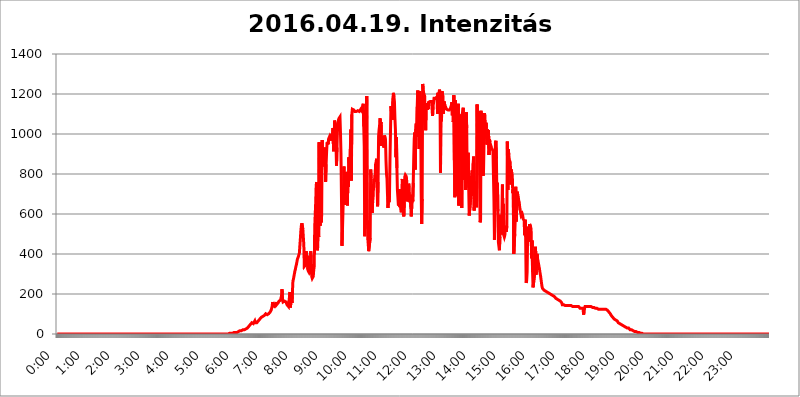
| Category | 2016.04.19. Intenzitás [W/m^2] |
|---|---|
| 0.0 | 0 |
| 0.0006944444444444445 | 0 |
| 0.001388888888888889 | 0 |
| 0.0020833333333333333 | 0 |
| 0.002777777777777778 | 0 |
| 0.003472222222222222 | 0 |
| 0.004166666666666667 | 0 |
| 0.004861111111111111 | 0 |
| 0.005555555555555556 | 0 |
| 0.0062499999999999995 | 0 |
| 0.006944444444444444 | 0 |
| 0.007638888888888889 | 0 |
| 0.008333333333333333 | 0 |
| 0.009027777777777779 | 0 |
| 0.009722222222222222 | 0 |
| 0.010416666666666666 | 0 |
| 0.011111111111111112 | 0 |
| 0.011805555555555555 | 0 |
| 0.012499999999999999 | 0 |
| 0.013194444444444444 | 0 |
| 0.013888888888888888 | 0 |
| 0.014583333333333332 | 0 |
| 0.015277777777777777 | 0 |
| 0.015972222222222224 | 0 |
| 0.016666666666666666 | 0 |
| 0.017361111111111112 | 0 |
| 0.018055555555555557 | 0 |
| 0.01875 | 0 |
| 0.019444444444444445 | 0 |
| 0.02013888888888889 | 0 |
| 0.020833333333333332 | 0 |
| 0.02152777777777778 | 0 |
| 0.022222222222222223 | 0 |
| 0.02291666666666667 | 0 |
| 0.02361111111111111 | 0 |
| 0.024305555555555556 | 0 |
| 0.024999999999999998 | 0 |
| 0.025694444444444447 | 0 |
| 0.02638888888888889 | 0 |
| 0.027083333333333334 | 0 |
| 0.027777777777777776 | 0 |
| 0.02847222222222222 | 0 |
| 0.029166666666666664 | 0 |
| 0.029861111111111113 | 0 |
| 0.030555555555555555 | 0 |
| 0.03125 | 0 |
| 0.03194444444444445 | 0 |
| 0.03263888888888889 | 0 |
| 0.03333333333333333 | 0 |
| 0.034027777777777775 | 0 |
| 0.034722222222222224 | 0 |
| 0.035416666666666666 | 0 |
| 0.036111111111111115 | 0 |
| 0.03680555555555556 | 0 |
| 0.0375 | 0 |
| 0.03819444444444444 | 0 |
| 0.03888888888888889 | 0 |
| 0.03958333333333333 | 0 |
| 0.04027777777777778 | 0 |
| 0.04097222222222222 | 0 |
| 0.041666666666666664 | 0 |
| 0.042361111111111106 | 0 |
| 0.04305555555555556 | 0 |
| 0.043750000000000004 | 0 |
| 0.044444444444444446 | 0 |
| 0.04513888888888889 | 0 |
| 0.04583333333333334 | 0 |
| 0.04652777777777778 | 0 |
| 0.04722222222222222 | 0 |
| 0.04791666666666666 | 0 |
| 0.04861111111111111 | 0 |
| 0.049305555555555554 | 0 |
| 0.049999999999999996 | 0 |
| 0.05069444444444445 | 0 |
| 0.051388888888888894 | 0 |
| 0.052083333333333336 | 0 |
| 0.05277777777777778 | 0 |
| 0.05347222222222222 | 0 |
| 0.05416666666666667 | 0 |
| 0.05486111111111111 | 0 |
| 0.05555555555555555 | 0 |
| 0.05625 | 0 |
| 0.05694444444444444 | 0 |
| 0.057638888888888885 | 0 |
| 0.05833333333333333 | 0 |
| 0.05902777777777778 | 0 |
| 0.059722222222222225 | 0 |
| 0.06041666666666667 | 0 |
| 0.061111111111111116 | 0 |
| 0.06180555555555556 | 0 |
| 0.0625 | 0 |
| 0.06319444444444444 | 0 |
| 0.06388888888888888 | 0 |
| 0.06458333333333334 | 0 |
| 0.06527777777777778 | 0 |
| 0.06597222222222222 | 0 |
| 0.06666666666666667 | 0 |
| 0.06736111111111111 | 0 |
| 0.06805555555555555 | 0 |
| 0.06874999999999999 | 0 |
| 0.06944444444444443 | 0 |
| 0.07013888888888889 | 0 |
| 0.07083333333333333 | 0 |
| 0.07152777777777779 | 0 |
| 0.07222222222222223 | 0 |
| 0.07291666666666667 | 0 |
| 0.07361111111111111 | 0 |
| 0.07430555555555556 | 0 |
| 0.075 | 0 |
| 0.07569444444444444 | 0 |
| 0.0763888888888889 | 0 |
| 0.07708333333333334 | 0 |
| 0.07777777777777778 | 0 |
| 0.07847222222222222 | 0 |
| 0.07916666666666666 | 0 |
| 0.0798611111111111 | 0 |
| 0.08055555555555556 | 0 |
| 0.08125 | 0 |
| 0.08194444444444444 | 0 |
| 0.08263888888888889 | 0 |
| 0.08333333333333333 | 0 |
| 0.08402777777777777 | 0 |
| 0.08472222222222221 | 0 |
| 0.08541666666666665 | 0 |
| 0.08611111111111112 | 0 |
| 0.08680555555555557 | 0 |
| 0.08750000000000001 | 0 |
| 0.08819444444444445 | 0 |
| 0.08888888888888889 | 0 |
| 0.08958333333333333 | 0 |
| 0.09027777777777778 | 0 |
| 0.09097222222222222 | 0 |
| 0.09166666666666667 | 0 |
| 0.09236111111111112 | 0 |
| 0.09305555555555556 | 0 |
| 0.09375 | 0 |
| 0.09444444444444444 | 0 |
| 0.09513888888888888 | 0 |
| 0.09583333333333333 | 0 |
| 0.09652777777777777 | 0 |
| 0.09722222222222222 | 0 |
| 0.09791666666666667 | 0 |
| 0.09861111111111111 | 0 |
| 0.09930555555555555 | 0 |
| 0.09999999999999999 | 0 |
| 0.10069444444444443 | 0 |
| 0.1013888888888889 | 0 |
| 0.10208333333333335 | 0 |
| 0.10277777777777779 | 0 |
| 0.10347222222222223 | 0 |
| 0.10416666666666667 | 0 |
| 0.10486111111111111 | 0 |
| 0.10555555555555556 | 0 |
| 0.10625 | 0 |
| 0.10694444444444444 | 0 |
| 0.1076388888888889 | 0 |
| 0.10833333333333334 | 0 |
| 0.10902777777777778 | 0 |
| 0.10972222222222222 | 0 |
| 0.1111111111111111 | 0 |
| 0.11180555555555556 | 0 |
| 0.11180555555555556 | 0 |
| 0.1125 | 0 |
| 0.11319444444444444 | 0 |
| 0.11388888888888889 | 0 |
| 0.11458333333333333 | 0 |
| 0.11527777777777777 | 0 |
| 0.11597222222222221 | 0 |
| 0.11666666666666665 | 0 |
| 0.1173611111111111 | 0 |
| 0.11805555555555557 | 0 |
| 0.11944444444444445 | 0 |
| 0.12013888888888889 | 0 |
| 0.12083333333333333 | 0 |
| 0.12152777777777778 | 0 |
| 0.12222222222222223 | 0 |
| 0.12291666666666667 | 0 |
| 0.12291666666666667 | 0 |
| 0.12361111111111112 | 0 |
| 0.12430555555555556 | 0 |
| 0.125 | 0 |
| 0.12569444444444444 | 0 |
| 0.12638888888888888 | 0 |
| 0.12708333333333333 | 0 |
| 0.16875 | 0 |
| 0.12847222222222224 | 0 |
| 0.12916666666666668 | 0 |
| 0.12986111111111112 | 0 |
| 0.13055555555555556 | 0 |
| 0.13125 | 0 |
| 0.13194444444444445 | 0 |
| 0.1326388888888889 | 0 |
| 0.13333333333333333 | 0 |
| 0.13402777777777777 | 0 |
| 0.13402777777777777 | 0 |
| 0.13472222222222222 | 0 |
| 0.13541666666666666 | 0 |
| 0.1361111111111111 | 0 |
| 0.13749999999999998 | 0 |
| 0.13819444444444443 | 0 |
| 0.1388888888888889 | 0 |
| 0.13958333333333334 | 0 |
| 0.14027777777777778 | 0 |
| 0.14097222222222222 | 0 |
| 0.14166666666666666 | 0 |
| 0.1423611111111111 | 0 |
| 0.14305555555555557 | 0 |
| 0.14375000000000002 | 0 |
| 0.14444444444444446 | 0 |
| 0.1451388888888889 | 0 |
| 0.1451388888888889 | 0 |
| 0.14652777777777778 | 0 |
| 0.14722222222222223 | 0 |
| 0.14791666666666667 | 0 |
| 0.1486111111111111 | 0 |
| 0.14930555555555555 | 0 |
| 0.15 | 0 |
| 0.15069444444444444 | 0 |
| 0.15138888888888888 | 0 |
| 0.15208333333333332 | 0 |
| 0.15277777777777776 | 0 |
| 0.15347222222222223 | 0 |
| 0.15416666666666667 | 0 |
| 0.15486111111111112 | 0 |
| 0.15555555555555556 | 0 |
| 0.15625 | 0 |
| 0.15694444444444444 | 0 |
| 0.15763888888888888 | 0 |
| 0.15833333333333333 | 0 |
| 0.15902777777777777 | 0 |
| 0.15972222222222224 | 0 |
| 0.16041666666666668 | 0 |
| 0.16111111111111112 | 0 |
| 0.16180555555555556 | 0 |
| 0.1625 | 0 |
| 0.16319444444444445 | 0 |
| 0.1638888888888889 | 0 |
| 0.16458333333333333 | 0 |
| 0.16527777777777777 | 0 |
| 0.16597222222222222 | 0 |
| 0.16666666666666666 | 0 |
| 0.1673611111111111 | 0 |
| 0.16805555555555554 | 0 |
| 0.16874999999999998 | 0 |
| 0.16944444444444443 | 0 |
| 0.17013888888888887 | 0 |
| 0.1708333333333333 | 0 |
| 0.17152777777777775 | 0 |
| 0.17222222222222225 | 0 |
| 0.1729166666666667 | 0 |
| 0.17361111111111113 | 0 |
| 0.17430555555555557 | 0 |
| 0.17500000000000002 | 0 |
| 0.17569444444444446 | 0 |
| 0.1763888888888889 | 0 |
| 0.17708333333333334 | 0 |
| 0.17777777777777778 | 0 |
| 0.17847222222222223 | 0 |
| 0.17916666666666667 | 0 |
| 0.1798611111111111 | 0 |
| 0.18055555555555555 | 0 |
| 0.18125 | 0 |
| 0.18194444444444444 | 0 |
| 0.1826388888888889 | 0 |
| 0.18333333333333335 | 0 |
| 0.1840277777777778 | 0 |
| 0.18472222222222223 | 0 |
| 0.18541666666666667 | 0 |
| 0.18611111111111112 | 0 |
| 0.18680555555555556 | 0 |
| 0.1875 | 0 |
| 0.18819444444444444 | 0 |
| 0.18888888888888888 | 0 |
| 0.18958333333333333 | 0 |
| 0.19027777777777777 | 0 |
| 0.1909722222222222 | 0 |
| 0.19166666666666665 | 0 |
| 0.19236111111111112 | 0 |
| 0.19305555555555554 | 0 |
| 0.19375 | 0 |
| 0.19444444444444445 | 0 |
| 0.1951388888888889 | 0 |
| 0.19583333333333333 | 0 |
| 0.19652777777777777 | 0 |
| 0.19722222222222222 | 0 |
| 0.19791666666666666 | 0 |
| 0.1986111111111111 | 0 |
| 0.19930555555555554 | 0 |
| 0.19999999999999998 | 0 |
| 0.20069444444444443 | 0 |
| 0.20138888888888887 | 0 |
| 0.2020833333333333 | 0 |
| 0.2027777777777778 | 0 |
| 0.2034722222222222 | 0 |
| 0.2041666666666667 | 0 |
| 0.20486111111111113 | 0 |
| 0.20555555555555557 | 0 |
| 0.20625000000000002 | 0 |
| 0.20694444444444446 | 0 |
| 0.2076388888888889 | 0 |
| 0.20833333333333334 | 0 |
| 0.20902777777777778 | 0 |
| 0.20972222222222223 | 0 |
| 0.21041666666666667 | 0 |
| 0.2111111111111111 | 0 |
| 0.21180555555555555 | 0 |
| 0.2125 | 0 |
| 0.21319444444444444 | 0 |
| 0.2138888888888889 | 0 |
| 0.21458333333333335 | 0 |
| 0.2152777777777778 | 0 |
| 0.21597222222222223 | 0 |
| 0.21666666666666667 | 0 |
| 0.21736111111111112 | 0 |
| 0.21805555555555556 | 0 |
| 0.21875 | 0 |
| 0.21944444444444444 | 0 |
| 0.22013888888888888 | 0 |
| 0.22083333333333333 | 0 |
| 0.22152777777777777 | 0 |
| 0.2222222222222222 | 0 |
| 0.22291666666666665 | 0 |
| 0.2236111111111111 | 0 |
| 0.22430555555555556 | 0 |
| 0.225 | 0 |
| 0.22569444444444445 | 0 |
| 0.2263888888888889 | 0 |
| 0.22708333333333333 | 0 |
| 0.22777777777777777 | 0 |
| 0.22847222222222222 | 0 |
| 0.22916666666666666 | 0 |
| 0.2298611111111111 | 0 |
| 0.23055555555555554 | 0 |
| 0.23124999999999998 | 0 |
| 0.23194444444444443 | 0 |
| 0.23263888888888887 | 0 |
| 0.2333333333333333 | 0 |
| 0.2340277777777778 | 0 |
| 0.2347222222222222 | 0 |
| 0.2354166666666667 | 0 |
| 0.23611111111111113 | 0 |
| 0.23680555555555557 | 0 |
| 0.23750000000000002 | 0 |
| 0.23819444444444446 | 0 |
| 0.2388888888888889 | 0 |
| 0.23958333333333334 | 0 |
| 0.24027777777777778 | 0 |
| 0.24097222222222223 | 0 |
| 0.24166666666666667 | 3.525 |
| 0.2423611111111111 | 3.525 |
| 0.24305555555555555 | 3.525 |
| 0.24375 | 3.525 |
| 0.24444444444444446 | 3.525 |
| 0.24513888888888888 | 3.525 |
| 0.24583333333333335 | 3.525 |
| 0.2465277777777778 | 3.525 |
| 0.24722222222222223 | 3.525 |
| 0.24791666666666667 | 7.887 |
| 0.24861111111111112 | 7.887 |
| 0.24930555555555556 | 7.887 |
| 0.25 | 7.887 |
| 0.25069444444444444 | 7.887 |
| 0.2513888888888889 | 7.887 |
| 0.2520833333333333 | 7.887 |
| 0.25277777777777777 | 12.257 |
| 0.2534722222222222 | 12.257 |
| 0.25416666666666665 | 12.257 |
| 0.2548611111111111 | 12.257 |
| 0.2555555555555556 | 16.636 |
| 0.25625000000000003 | 16.636 |
| 0.2569444444444445 | 21.024 |
| 0.2576388888888889 | 21.024 |
| 0.25833333333333336 | 16.636 |
| 0.2590277777777778 | 16.636 |
| 0.25972222222222224 | 21.024 |
| 0.2604166666666667 | 21.024 |
| 0.2611111111111111 | 21.024 |
| 0.26180555555555557 | 21.024 |
| 0.2625 | 21.024 |
| 0.26319444444444445 | 21.024 |
| 0.2638888888888889 | 25.419 |
| 0.26458333333333334 | 25.419 |
| 0.2652777777777778 | 25.419 |
| 0.2659722222222222 | 29.823 |
| 0.26666666666666666 | 29.823 |
| 0.2673611111111111 | 34.234 |
| 0.26805555555555555 | 34.234 |
| 0.26875 | 38.653 |
| 0.26944444444444443 | 38.653 |
| 0.2701388888888889 | 43.079 |
| 0.2708333333333333 | 47.511 |
| 0.27152777777777776 | 51.951 |
| 0.2722222222222222 | 51.951 |
| 0.27291666666666664 | 56.398 |
| 0.2736111111111111 | 56.398 |
| 0.2743055555555555 | 60.85 |
| 0.27499999999999997 | 51.951 |
| 0.27569444444444446 | 56.398 |
| 0.27638888888888885 | 56.398 |
| 0.27708333333333335 | 65.31 |
| 0.2777777777777778 | 56.398 |
| 0.27847222222222223 | 51.951 |
| 0.2791666666666667 | 51.951 |
| 0.2798611111111111 | 56.398 |
| 0.28055555555555556 | 56.398 |
| 0.28125 | 60.85 |
| 0.28194444444444444 | 65.31 |
| 0.2826388888888889 | 69.775 |
| 0.2833333333333333 | 69.775 |
| 0.28402777777777777 | 74.246 |
| 0.2847222222222222 | 74.246 |
| 0.28541666666666665 | 78.722 |
| 0.28611111111111115 | 83.205 |
| 0.28680555555555554 | 83.205 |
| 0.28750000000000003 | 83.205 |
| 0.2881944444444445 | 87.692 |
| 0.2888888888888889 | 87.692 |
| 0.28958333333333336 | 92.184 |
| 0.2902777777777778 | 92.184 |
| 0.29097222222222224 | 92.184 |
| 0.2916666666666667 | 96.682 |
| 0.2923611111111111 | 101.184 |
| 0.29305555555555557 | 96.682 |
| 0.29375 | 96.682 |
| 0.29444444444444445 | 96.682 |
| 0.2951388888888889 | 96.682 |
| 0.29583333333333334 | 96.682 |
| 0.2965277777777778 | 101.184 |
| 0.2972222222222222 | 101.184 |
| 0.29791666666666666 | 101.184 |
| 0.2986111111111111 | 110.201 |
| 0.29930555555555555 | 114.716 |
| 0.3 | 119.235 |
| 0.30069444444444443 | 128.284 |
| 0.3013888888888889 | 137.347 |
| 0.3020833333333333 | 160.056 |
| 0.30277777777777776 | 141.884 |
| 0.3034722222222222 | 146.423 |
| 0.30416666666666664 | 141.884 |
| 0.3048611111111111 | 137.347 |
| 0.3055555555555555 | 141.884 |
| 0.30624999999999997 | 146.423 |
| 0.3069444444444444 | 160.056 |
| 0.3076388888888889 | 146.423 |
| 0.30833333333333335 | 146.423 |
| 0.3090277777777778 | 150.964 |
| 0.30972222222222223 | 155.509 |
| 0.3104166666666667 | 160.056 |
| 0.3111111111111111 | 164.605 |
| 0.31180555555555556 | 164.605 |
| 0.3125 | 169.156 |
| 0.31319444444444444 | 169.156 |
| 0.3138888888888889 | 169.156 |
| 0.3145833333333333 | 191.937 |
| 0.31527777777777777 | 223.873 |
| 0.3159722222222222 | 169.156 |
| 0.31666666666666665 | 160.056 |
| 0.31736111111111115 | 160.056 |
| 0.31805555555555554 | 160.056 |
| 0.31875000000000003 | 164.605 |
| 0.3194444444444445 | 164.605 |
| 0.3201388888888889 | 164.605 |
| 0.32083333333333336 | 160.056 |
| 0.3215277777777778 | 155.509 |
| 0.32222222222222224 | 146.423 |
| 0.3229166666666667 | 146.423 |
| 0.3236111111111111 | 141.884 |
| 0.32430555555555557 | 137.347 |
| 0.325 | 137.347 |
| 0.32569444444444445 | 141.884 |
| 0.3263888888888889 | 210.182 |
| 0.32708333333333334 | 132.814 |
| 0.3277777777777778 | 132.814 |
| 0.3284722222222222 | 205.62 |
| 0.32916666666666666 | 155.509 |
| 0.3298611111111111 | 210.182 |
| 0.33055555555555555 | 264.932 |
| 0.33125 | 274.047 |
| 0.33194444444444443 | 287.709 |
| 0.3326388888888889 | 301.354 |
| 0.3333333333333333 | 314.98 |
| 0.3340277777777778 | 324.052 |
| 0.3347222222222222 | 337.639 |
| 0.3354166666666667 | 346.682 |
| 0.3361111111111111 | 360.221 |
| 0.3368055555555556 | 373.729 |
| 0.33749999999999997 | 378.224 |
| 0.33819444444444446 | 387.202 |
| 0.33888888888888885 | 396.164 |
| 0.33958333333333335 | 405.108 |
| 0.34027777777777773 | 440.702 |
| 0.34097222222222223 | 475.972 |
| 0.3416666666666666 | 515.223 |
| 0.3423611111111111 | 541.121 |
| 0.3430555555555555 | 553.986 |
| 0.34375 | 558.261 |
| 0.3444444444444445 | 523.88 |
| 0.3451388888888889 | 484.735 |
| 0.3458333333333334 | 445.129 |
| 0.34652777777777777 | 337.639 |
| 0.34722222222222227 | 333.113 |
| 0.34791666666666665 | 333.113 |
| 0.34861111111111115 | 346.682 |
| 0.34930555555555554 | 414.035 |
| 0.35000000000000003 | 346.682 |
| 0.3506944444444444 | 391.685 |
| 0.3513888888888889 | 324.052 |
| 0.3520833333333333 | 314.98 |
| 0.3527777777777778 | 319.517 |
| 0.3534722222222222 | 305.898 |
| 0.3541666666666667 | 305.898 |
| 0.3548611111111111 | 314.98 |
| 0.35555555555555557 | 414.035 |
| 0.35625 | 328.584 |
| 0.35694444444444445 | 287.709 |
| 0.3576388888888889 | 278.603 |
| 0.35833333333333334 | 283.156 |
| 0.3590277777777778 | 287.709 |
| 0.3597222222222222 | 319.517 |
| 0.36041666666666666 | 337.639 |
| 0.3611111111111111 | 532.513 |
| 0.36180555555555555 | 596.45 |
| 0.3625 | 658.909 |
| 0.36319444444444443 | 743.859 |
| 0.3638888888888889 | 759.723 |
| 0.3645833333333333 | 418.492 |
| 0.3652777777777778 | 431.833 |
| 0.3659722222222222 | 515.223 |
| 0.3666666666666667 | 484.735 |
| 0.3673611111111111 | 958.814 |
| 0.3680555555555556 | 642.4 |
| 0.36874999999999997 | 541.121 |
| 0.36944444444444446 | 650.667 |
| 0.37013888888888885 | 558.261 |
| 0.37083333333333335 | 592.233 |
| 0.37152777777777773 | 970.034 |
| 0.37222222222222223 | 891.099 |
| 0.3729166666666666 | 837.682 |
| 0.3736111111111111 | 902.447 |
| 0.3743055555555555 | 921.298 |
| 0.375 | 932.576 |
| 0.3756944444444445 | 891.099 |
| 0.3763888888888889 | 759.723 |
| 0.3770833333333334 | 849.199 |
| 0.37777777777777777 | 909.996 |
| 0.37847222222222227 | 958.814 |
| 0.37916666666666665 | 958.814 |
| 0.37986111111111115 | 947.58 |
| 0.38055555555555554 | 973.772 |
| 0.38125000000000003 | 981.244 |
| 0.3819444444444444 | 984.98 |
| 0.3826388888888889 | 992.448 |
| 0.3833333333333333 | 996.182 |
| 0.3840277777777778 | 984.98 |
| 0.3847222222222222 | 966.295 |
| 0.3854166666666667 | 966.295 |
| 0.3861111111111111 | 1003.65 |
| 0.38680555555555557 | 1029.798 |
| 0.3875 | 913.766 |
| 0.38819444444444445 | 951.327 |
| 0.3888888888888889 | 1067.267 |
| 0.38958333333333334 | 1067.267 |
| 0.3902777777777778 | 1044.762 |
| 0.3909722222222222 | 1044.762 |
| 0.39166666666666666 | 841.526 |
| 0.3923611111111111 | 932.576 |
| 0.39305555555555555 | 1037.277 |
| 0.39375 | 1037.277 |
| 0.39444444444444443 | 1071.027 |
| 0.3951388888888889 | 1078.555 |
| 0.3958333333333333 | 1082.324 |
| 0.3965277777777778 | 1086.097 |
| 0.3972222222222222 | 1007.383 |
| 0.3979166666666667 | 906.223 |
| 0.3986111111111111 | 687.544 |
| 0.3993055555555556 | 440.702 |
| 0.39999999999999997 | 519.555 |
| 0.40069444444444446 | 609.062 |
| 0.40138888888888885 | 707.8 |
| 0.40208333333333335 | 837.682 |
| 0.40277777777777773 | 755.766 |
| 0.40347222222222223 | 775.492 |
| 0.4041666666666666 | 646.537 |
| 0.4048611111111111 | 719.877 |
| 0.4055555555555555 | 810.641 |
| 0.40625 | 735.89 |
| 0.4069444444444445 | 642.4 |
| 0.4076388888888889 | 775.492 |
| 0.4083333333333334 | 735.89 |
| 0.40902777777777777 | 883.516 |
| 0.40972222222222227 | 879.719 |
| 0.41041666666666665 | 829.981 |
| 0.41111111111111115 | 925.06 |
| 0.41180555555555554 | 1022.323 |
| 0.41250000000000003 | 767.62 |
| 0.4131944444444444 | 1097.437 |
| 0.4138888888888889 | 1124.056 |
| 0.4145833333333333 | 1124.056 |
| 0.4152777777777778 | 1120.238 |
| 0.4159722222222222 | 1120.238 |
| 0.4166666666666667 | 1116.426 |
| 0.4173611111111111 | 1112.618 |
| 0.41805555555555557 | 1112.618 |
| 0.41875 | 1112.618 |
| 0.41944444444444445 | 1112.618 |
| 0.4201388888888889 | 1112.618 |
| 0.42083333333333334 | 1116.426 |
| 0.4215277777777778 | 1116.426 |
| 0.4222222222222222 | 1116.426 |
| 0.42291666666666666 | 1116.426 |
| 0.4236111111111111 | 1112.618 |
| 0.42430555555555555 | 1112.618 |
| 0.425 | 1116.426 |
| 0.42569444444444443 | 1124.056 |
| 0.4263888888888889 | 1127.879 |
| 0.4270833333333333 | 1116.426 |
| 0.4277777777777778 | 1131.708 |
| 0.4284722222222222 | 1139.384 |
| 0.4291666666666667 | 1150.946 |
| 0.4298611111111111 | 1037.277 |
| 0.4305555555555556 | 940.082 |
| 0.43124999999999997 | 489.108 |
| 0.43194444444444446 | 493.475 |
| 0.43263888888888885 | 735.89 |
| 0.43333333333333335 | 699.717 |
| 0.43402777777777773 | 1189.969 |
| 0.43472222222222223 | 545.416 |
| 0.4354166666666666 | 566.793 |
| 0.4361111111111111 | 453.968 |
| 0.4368055555555555 | 414.035 |
| 0.4375 | 409.574 |
| 0.4381944444444445 | 418.492 |
| 0.4388888888888889 | 480.356 |
| 0.4395833333333334 | 822.26 |
| 0.44027777777777777 | 779.42 |
| 0.44097222222222227 | 695.666 |
| 0.44166666666666665 | 604.864 |
| 0.44236111111111115 | 658.909 |
| 0.44305555555555554 | 687.544 |
| 0.44375000000000003 | 751.803 |
| 0.4444444444444444 | 775.492 |
| 0.4451388888888889 | 759.723 |
| 0.4458333333333333 | 795.074 |
| 0.4465277777777778 | 849.199 |
| 0.4472222222222222 | 860.676 |
| 0.4479166666666667 | 875.918 |
| 0.4486111111111111 | 731.896 |
| 0.44930555555555557 | 638.256 |
| 0.45 | 759.723 |
| 0.45069444444444445 | 988.714 |
| 0.4513888888888889 | 1022.323 |
| 0.45208333333333334 | 1041.019 |
| 0.4527777777777778 | 1078.555 |
| 0.4534722222222222 | 1044.762 |
| 0.45416666666666666 | 1059.756 |
| 0.4548611111111111 | 940.082 |
| 0.45555555555555555 | 951.327 |
| 0.45625 | 970.034 |
| 0.45694444444444443 | 977.508 |
| 0.4576388888888889 | 988.714 |
| 0.4583333333333333 | 932.576 |
| 0.4590277777777778 | 992.448 |
| 0.4597222222222222 | 992.448 |
| 0.4604166666666667 | 966.295 |
| 0.4611111111111111 | 864.493 |
| 0.4618055555555556 | 798.974 |
| 0.46249999999999997 | 775.492 |
| 0.46319444444444446 | 695.666 |
| 0.46388888888888885 | 629.948 |
| 0.46458333333333335 | 695.666 |
| 0.46527777777777773 | 658.909 |
| 0.46597222222222223 | 691.608 |
| 0.4666666666666666 | 872.114 |
| 0.4673611111111111 | 1007.383 |
| 0.4680555555555555 | 1139.384 |
| 0.46875 | 1108.816 |
| 0.4694444444444445 | 1105.019 |
| 0.4701388888888889 | 1071.027 |
| 0.4708333333333334 | 1178.177 |
| 0.47152777777777777 | 1205.82 |
| 0.47222222222222227 | 1186.03 |
| 0.47291666666666665 | 1162.571 |
| 0.47361111111111115 | 1078.555 |
| 0.47430555555555554 | 1022.323 |
| 0.47500000000000003 | 883.516 |
| 0.4756944444444444 | 984.98 |
| 0.4763888888888889 | 829.981 |
| 0.4770833333333333 | 719.877 |
| 0.4777777777777778 | 683.473 |
| 0.4784722222222222 | 642.4 |
| 0.4791666666666667 | 691.608 |
| 0.4798611111111111 | 723.889 |
| 0.48055555555555557 | 634.105 |
| 0.48125 | 650.667 |
| 0.48194444444444445 | 654.791 |
| 0.4826388888888889 | 609.062 |
| 0.48333333333333334 | 719.877 |
| 0.4840277777777778 | 775.492 |
| 0.4847222222222222 | 629.948 |
| 0.48541666666666666 | 596.45 |
| 0.4861111111111111 | 588.009 |
| 0.48680555555555555 | 663.019 |
| 0.4875 | 787.258 |
| 0.48819444444444443 | 795.074 |
| 0.4888888888888889 | 798.974 |
| 0.4895833333333333 | 787.258 |
| 0.4902777777777778 | 759.723 |
| 0.4909722222222222 | 663.019 |
| 0.4916666666666667 | 699.717 |
| 0.4923611111111111 | 711.832 |
| 0.4930555555555556 | 751.803 |
| 0.49374999999999997 | 687.544 |
| 0.49444444444444446 | 658.909 |
| 0.49513888888888885 | 695.666 |
| 0.49583333333333335 | 634.105 |
| 0.49652777777777773 | 588.009 |
| 0.49722222222222223 | 588.009 |
| 0.4979166666666666 | 695.666 |
| 0.4986111111111111 | 663.019 |
| 0.4993055555555555 | 755.766 |
| 0.5 | 883.516 |
| 0.5006944444444444 | 977.508 |
| 0.5013888888888889 | 1007.383 |
| 0.5020833333333333 | 822.26 |
| 0.5027777777777778 | 1026.06 |
| 0.5034722222222222 | 1052.255 |
| 0.5041666666666667 | 984.98 |
| 0.5048611111111111 | 1135.543 |
| 0.5055555555555555 | 1217.812 |
| 0.50625 | 1166.46 |
| 0.5069444444444444 | 1178.177 |
| 0.5076388888888889 | 925.06 |
| 0.5083333333333333 | 1213.804 |
| 0.5090277777777777 | 1209.807 |
| 0.5097222222222222 | 1154.814 |
| 0.5104166666666666 | 707.8 |
| 0.5111111111111112 | 549.704 |
| 0.5118055555555555 | 675.311 |
| 0.5125000000000001 | 1250.275 |
| 0.5131944444444444 | 1225.859 |
| 0.513888888888889 | 1205.82 |
| 0.5145833333333333 | 1197.876 |
| 0.5152777777777778 | 1189.969 |
| 0.5159722222222222 | 1101.226 |
| 0.5166666666666667 | 1018.587 |
| 0.517361111111111 | 1120.238 |
| 0.5180555555555556 | 1150.946 |
| 0.5187499999999999 | 1120.238 |
| 0.5194444444444445 | 1154.814 |
| 0.5201388888888888 | 1124.056 |
| 0.5208333333333334 | 1158.689 |
| 0.5215277777777778 | 1158.689 |
| 0.5222222222222223 | 1158.689 |
| 0.5229166666666667 | 1162.571 |
| 0.5236111111111111 | 1158.689 |
| 0.5243055555555556 | 1158.689 |
| 0.525 | 1162.571 |
| 0.5256944444444445 | 1162.571 |
| 0.5263888888888889 | 1089.873 |
| 0.5270833333333333 | 1139.384 |
| 0.5277777777777778 | 1154.814 |
| 0.5284722222222222 | 1178.177 |
| 0.5291666666666667 | 1178.177 |
| 0.5298611111111111 | 1178.177 |
| 0.5305555555555556 | 1178.177 |
| 0.53125 | 1182.099 |
| 0.5319444444444444 | 1182.099 |
| 0.5326388888888889 | 1186.03 |
| 0.5333333333333333 | 1101.226 |
| 0.5340277777777778 | 1205.82 |
| 0.5347222222222222 | 1124.056 |
| 0.5354166666666667 | 1201.843 |
| 0.5361111111111111 | 1221.83 |
| 0.5368055555555555 | 1205.82 |
| 0.5375 | 806.757 |
| 0.5381944444444444 | 1178.177 |
| 0.5388888888888889 | 1063.51 |
| 0.5395833333333333 | 1213.804 |
| 0.5402777777777777 | 1197.876 |
| 0.5409722222222222 | 1189.969 |
| 0.5416666666666666 | 1101.226 |
| 0.5423611111111112 | 1162.571 |
| 0.5430555555555555 | 1158.689 |
| 0.5437500000000001 | 1143.232 |
| 0.5444444444444444 | 1139.384 |
| 0.545138888888889 | 1131.708 |
| 0.5458333333333333 | 1124.056 |
| 0.5465277777777778 | 1124.056 |
| 0.5472222222222222 | 1124.056 |
| 0.5479166666666667 | 1120.238 |
| 0.548611111111111 | 1120.238 |
| 0.5493055555555556 | 1120.238 |
| 0.5499999999999999 | 1120.238 |
| 0.5506944444444445 | 1124.056 |
| 0.5513888888888888 | 1127.879 |
| 0.5520833333333334 | 1135.543 |
| 0.5527777777777778 | 1143.232 |
| 0.5534722222222223 | 1158.689 |
| 0.5541666666666667 | 1093.653 |
| 0.5548611111111111 | 1158.689 |
| 0.5555555555555556 | 1059.756 |
| 0.55625 | 1193.918 |
| 0.5569444444444445 | 868.305 |
| 0.5576388888888889 | 683.473 |
| 0.5583333333333333 | 1170.358 |
| 0.5590277777777778 | 1074.789 |
| 0.5597222222222222 | 783.342 |
| 0.5604166666666667 | 841.526 |
| 0.5611111111111111 | 691.608 |
| 0.5618055555555556 | 898.668 |
| 0.5625 | 1150.946 |
| 0.5631944444444444 | 642.4 |
| 0.5638888888888889 | 860.676 |
| 0.5645833333333333 | 902.447 |
| 0.5652777777777778 | 1097.437 |
| 0.5659722222222222 | 1089.873 |
| 0.5666666666666667 | 1071.027 |
| 0.5673611111111111 | 629.948 |
| 0.5680555555555555 | 1101.226 |
| 0.56875 | 1105.019 |
| 0.5694444444444444 | 1131.708 |
| 0.5701388888888889 | 771.559 |
| 0.5708333333333333 | 818.392 |
| 0.5715277777777777 | 1063.51 |
| 0.5722222222222222 | 1093.653 |
| 0.5729166666666666 | 719.877 |
| 0.5736111111111112 | 1108.816 |
| 0.5743055555555555 | 1029.798 |
| 0.5750000000000001 | 751.803 |
| 0.5756944444444444 | 864.493 |
| 0.576388888888889 | 906.223 |
| 0.5770833333333333 | 731.896 |
| 0.5777777777777778 | 592.233 |
| 0.5784722222222222 | 596.45 |
| 0.5791666666666667 | 592.233 |
| 0.579861111111111 | 679.395 |
| 0.5805555555555556 | 755.766 |
| 0.5812499999999999 | 795.074 |
| 0.5819444444444445 | 818.392 |
| 0.5826388888888888 | 691.608 |
| 0.5833333333333334 | 853.029 |
| 0.5840277777777778 | 887.309 |
| 0.5847222222222223 | 617.436 |
| 0.5854166666666667 | 654.791 |
| 0.5861111111111111 | 687.544 |
| 0.5868055555555556 | 695.666 |
| 0.5875 | 763.674 |
| 0.5881944444444445 | 634.105 |
| 0.5888888888888889 | 1147.086 |
| 0.5895833333333333 | 958.814 |
| 0.5902777777777778 | 1048.508 |
| 0.5909722222222222 | 1112.618 |
| 0.5916666666666667 | 1086.097 |
| 0.5923611111111111 | 1086.097 |
| 0.5930555555555556 | 558.261 |
| 0.59375 | 571.049 |
| 0.5944444444444444 | 1116.426 |
| 0.5951388888888889 | 999.916 |
| 0.5958333333333333 | 1105.019 |
| 0.5965277777777778 | 1108.816 |
| 0.5972222222222222 | 791.169 |
| 0.5979166666666667 | 822.26 |
| 0.5986111111111111 | 966.295 |
| 0.5993055555555555 | 1105.019 |
| 0.6 | 1052.255 |
| 0.6006944444444444 | 977.508 |
| 0.6013888888888889 | 1056.004 |
| 0.6020833333333333 | 1059.756 |
| 0.6027777777777777 | 947.58 |
| 0.6034722222222222 | 1022.323 |
| 0.6041666666666666 | 999.916 |
| 0.6048611111111112 | 1018.587 |
| 0.6055555555555555 | 894.885 |
| 0.6062500000000001 | 973.772 |
| 0.6069444444444444 | 958.814 |
| 0.607638888888889 | 947.58 |
| 0.6083333333333333 | 940.082 |
| 0.6090277777777778 | 932.576 |
| 0.6097222222222222 | 928.819 |
| 0.6104166666666667 | 921.298 |
| 0.611111111111111 | 913.766 |
| 0.6118055555555556 | 913.766 |
| 0.6124999999999999 | 667.123 |
| 0.6131944444444445 | 471.582 |
| 0.6138888888888888 | 687.544 |
| 0.6145833333333334 | 958.814 |
| 0.6152777777777778 | 966.295 |
| 0.6159722222222223 | 875.918 |
| 0.6166666666666667 | 663.019 |
| 0.6173611111111111 | 755.766 |
| 0.6180555555555556 | 613.252 |
| 0.61875 | 458.38 |
| 0.6194444444444445 | 453.968 |
| 0.6201388888888889 | 418.492 |
| 0.6208333333333333 | 484.735 |
| 0.6215277777777778 | 596.45 |
| 0.6222222222222222 | 523.88 |
| 0.6229166666666667 | 497.836 |
| 0.6236111111111111 | 588.009 |
| 0.6243055555555556 | 747.834 |
| 0.625 | 613.252 |
| 0.6256944444444444 | 650.667 |
| 0.6263888888888889 | 493.475 |
| 0.6270833333333333 | 484.735 |
| 0.6277777777777778 | 493.475 |
| 0.6284722222222222 | 541.121 |
| 0.6291666666666667 | 519.555 |
| 0.6298611111111111 | 510.885 |
| 0.6305555555555555 | 541.121 |
| 0.63125 | 962.555 |
| 0.6319444444444444 | 719.877 |
| 0.6326388888888889 | 925.06 |
| 0.6333333333333333 | 894.885 |
| 0.6340277777777777 | 872.114 |
| 0.6347222222222222 | 872.114 |
| 0.6354166666666666 | 856.855 |
| 0.6361111111111112 | 747.834 |
| 0.6368055555555555 | 822.26 |
| 0.6375000000000001 | 802.868 |
| 0.6381944444444444 | 795.074 |
| 0.638888888888889 | 703.762 |
| 0.6395833333333333 | 723.889 |
| 0.6402777777777778 | 400.638 |
| 0.6409722222222222 | 405.108 |
| 0.6416666666666667 | 502.192 |
| 0.642361111111111 | 575.299 |
| 0.6430555555555556 | 735.89 |
| 0.6437499999999999 | 562.53 |
| 0.6444444444444445 | 634.105 |
| 0.6451388888888888 | 711.832 |
| 0.6458333333333334 | 695.666 |
| 0.6465277777777778 | 687.544 |
| 0.6472222222222223 | 667.123 |
| 0.6479166666666667 | 658.909 |
| 0.6486111111111111 | 634.105 |
| 0.6493055555555556 | 634.105 |
| 0.65 | 604.864 |
| 0.6506944444444445 | 592.233 |
| 0.6513888888888889 | 592.233 |
| 0.6520833333333333 | 600.661 |
| 0.6527777777777778 | 592.233 |
| 0.6534722222222222 | 575.299 |
| 0.6541666666666667 | 571.049 |
| 0.6548611111111111 | 566.793 |
| 0.6555555555555556 | 493.475 |
| 0.65625 | 571.049 |
| 0.6569444444444444 | 484.735 |
| 0.6576388888888889 | 255.813 |
| 0.6583333333333333 | 264.932 |
| 0.6590277777777778 | 310.44 |
| 0.6597222222222222 | 489.108 |
| 0.6604166666666667 | 536.82 |
| 0.6611111111111111 | 462.786 |
| 0.6618055555555555 | 523.88 |
| 0.6625 | 549.704 |
| 0.6631944444444444 | 545.416 |
| 0.6638888888888889 | 536.82 |
| 0.6645833333333333 | 523.88 |
| 0.6652777777777777 | 378.224 |
| 0.6659722222222222 | 467.187 |
| 0.6666666666666666 | 310.44 |
| 0.6673611111111111 | 233 |
| 0.6680555555555556 | 228.436 |
| 0.6687500000000001 | 237.564 |
| 0.6694444444444444 | 301.354 |
| 0.6701388888888888 | 373.729 |
| 0.6708333333333334 | 436.27 |
| 0.6715277777777778 | 296.808 |
| 0.6722222222222222 | 346.682 |
| 0.6729166666666666 | 400.638 |
| 0.6736111111111112 | 378.224 |
| 0.6743055555555556 | 364.728 |
| 0.6749999999999999 | 351.198 |
| 0.6756944444444444 | 337.639 |
| 0.6763888888888889 | 324.052 |
| 0.6770833333333334 | 305.898 |
| 0.6777777777777777 | 292.259 |
| 0.6784722222222223 | 274.047 |
| 0.6791666666666667 | 255.813 |
| 0.6798611111111111 | 237.564 |
| 0.6805555555555555 | 228.436 |
| 0.68125 | 228.436 |
| 0.6819444444444445 | 223.873 |
| 0.6826388888888889 | 219.309 |
| 0.6833333333333332 | 219.309 |
| 0.6840277777777778 | 219.309 |
| 0.6847222222222222 | 214.746 |
| 0.6854166666666667 | 214.746 |
| 0.686111111111111 | 210.182 |
| 0.6868055555555556 | 210.182 |
| 0.6875 | 210.182 |
| 0.6881944444444444 | 210.182 |
| 0.688888888888889 | 205.62 |
| 0.6895833333333333 | 205.62 |
| 0.6902777777777778 | 201.058 |
| 0.6909722222222222 | 201.058 |
| 0.6916666666666668 | 201.058 |
| 0.6923611111111111 | 196.497 |
| 0.6930555555555555 | 196.497 |
| 0.69375 | 191.937 |
| 0.6944444444444445 | 191.937 |
| 0.6951388888888889 | 191.937 |
| 0.6958333333333333 | 191.937 |
| 0.6965277777777777 | 187.378 |
| 0.6972222222222223 | 187.378 |
| 0.6979166666666666 | 182.82 |
| 0.6986111111111111 | 182.82 |
| 0.6993055555555556 | 178.264 |
| 0.7000000000000001 | 178.264 |
| 0.7006944444444444 | 173.709 |
| 0.7013888888888888 | 173.709 |
| 0.7020833333333334 | 173.709 |
| 0.7027777777777778 | 169.156 |
| 0.7034722222222222 | 169.156 |
| 0.7041666666666666 | 164.605 |
| 0.7048611111111112 | 164.605 |
| 0.7055555555555556 | 164.605 |
| 0.7062499999999999 | 164.605 |
| 0.7069444444444444 | 160.056 |
| 0.7076388888888889 | 155.509 |
| 0.7083333333333334 | 146.423 |
| 0.7090277777777777 | 146.423 |
| 0.7097222222222223 | 146.423 |
| 0.7104166666666667 | 146.423 |
| 0.7111111111111111 | 146.423 |
| 0.7118055555555555 | 141.884 |
| 0.7125 | 141.884 |
| 0.7131944444444445 | 141.884 |
| 0.7138888888888889 | 141.884 |
| 0.7145833333333332 | 141.884 |
| 0.7152777777777778 | 141.884 |
| 0.7159722222222222 | 141.884 |
| 0.7166666666666667 | 141.884 |
| 0.717361111111111 | 141.884 |
| 0.7180555555555556 | 141.884 |
| 0.71875 | 141.884 |
| 0.7194444444444444 | 141.884 |
| 0.720138888888889 | 141.884 |
| 0.7208333333333333 | 141.884 |
| 0.7215277777777778 | 137.347 |
| 0.7222222222222222 | 137.347 |
| 0.7229166666666668 | 137.347 |
| 0.7236111111111111 | 137.347 |
| 0.7243055555555555 | 137.347 |
| 0.725 | 137.347 |
| 0.7256944444444445 | 137.347 |
| 0.7263888888888889 | 137.347 |
| 0.7270833333333333 | 137.347 |
| 0.7277777777777777 | 137.347 |
| 0.7284722222222223 | 137.347 |
| 0.7291666666666666 | 137.347 |
| 0.7298611111111111 | 137.347 |
| 0.7305555555555556 | 137.347 |
| 0.7312500000000001 | 137.347 |
| 0.7319444444444444 | 137.347 |
| 0.7326388888888888 | 137.347 |
| 0.7333333333333334 | 128.284 |
| 0.7340277777777778 | 128.284 |
| 0.7347222222222222 | 123.758 |
| 0.7354166666666666 | 128.284 |
| 0.7361111111111112 | 132.814 |
| 0.7368055555555556 | 132.814 |
| 0.7374999999999999 | 128.284 |
| 0.7381944444444444 | 96.682 |
| 0.7388888888888889 | 110.201 |
| 0.7395833333333334 | 128.284 |
| 0.7402777777777777 | 137.347 |
| 0.7409722222222223 | 137.347 |
| 0.7416666666666667 | 137.347 |
| 0.7423611111111111 | 137.347 |
| 0.7430555555555555 | 137.347 |
| 0.74375 | 137.347 |
| 0.7444444444444445 | 137.347 |
| 0.7451388888888889 | 137.347 |
| 0.7458333333333332 | 137.347 |
| 0.7465277777777778 | 137.347 |
| 0.7472222222222222 | 137.347 |
| 0.7479166666666667 | 137.347 |
| 0.748611111111111 | 137.347 |
| 0.7493055555555556 | 137.347 |
| 0.75 | 137.347 |
| 0.7506944444444444 | 132.814 |
| 0.751388888888889 | 132.814 |
| 0.7520833333333333 | 132.814 |
| 0.7527777777777778 | 132.814 |
| 0.7534722222222222 | 128.284 |
| 0.7541666666666668 | 128.284 |
| 0.7548611111111111 | 128.284 |
| 0.7555555555555555 | 132.814 |
| 0.75625 | 128.284 |
| 0.7569444444444445 | 128.284 |
| 0.7576388888888889 | 128.284 |
| 0.7583333333333333 | 123.758 |
| 0.7590277777777777 | 123.758 |
| 0.7597222222222223 | 128.284 |
| 0.7604166666666666 | 128.284 |
| 0.7611111111111111 | 123.758 |
| 0.7618055555555556 | 123.758 |
| 0.7625000000000001 | 123.758 |
| 0.7631944444444444 | 123.758 |
| 0.7638888888888888 | 123.758 |
| 0.7645833333333334 | 123.758 |
| 0.7652777777777778 | 123.758 |
| 0.7659722222222222 | 123.758 |
| 0.7666666666666666 | 123.758 |
| 0.7673611111111112 | 123.758 |
| 0.7680555555555556 | 123.758 |
| 0.7687499999999999 | 123.758 |
| 0.7694444444444444 | 123.758 |
| 0.7701388888888889 | 123.758 |
| 0.7708333333333334 | 123.758 |
| 0.7715277777777777 | 119.235 |
| 0.7722222222222223 | 119.235 |
| 0.7729166666666667 | 114.716 |
| 0.7736111111111111 | 110.201 |
| 0.7743055555555555 | 110.201 |
| 0.775 | 105.69 |
| 0.7756944444444445 | 101.184 |
| 0.7763888888888889 | 96.682 |
| 0.7770833333333332 | 92.184 |
| 0.7777777777777778 | 92.184 |
| 0.7784722222222222 | 87.692 |
| 0.7791666666666667 | 83.205 |
| 0.779861111111111 | 83.205 |
| 0.7805555555555556 | 78.722 |
| 0.78125 | 74.246 |
| 0.7819444444444444 | 74.246 |
| 0.782638888888889 | 69.775 |
| 0.7833333333333333 | 69.775 |
| 0.7840277777777778 | 65.31 |
| 0.7847222222222222 | 65.31 |
| 0.7854166666666668 | 65.31 |
| 0.7861111111111111 | 60.85 |
| 0.7868055555555555 | 56.398 |
| 0.7875 | 56.398 |
| 0.7881944444444445 | 56.398 |
| 0.7888888888888889 | 51.951 |
| 0.7895833333333333 | 51.951 |
| 0.7902777777777777 | 47.511 |
| 0.7909722222222223 | 47.511 |
| 0.7916666666666666 | 47.511 |
| 0.7923611111111111 | 43.079 |
| 0.7930555555555556 | 43.079 |
| 0.7937500000000001 | 43.079 |
| 0.7944444444444444 | 38.653 |
| 0.7951388888888888 | 38.653 |
| 0.7958333333333334 | 38.653 |
| 0.7965277777777778 | 34.234 |
| 0.7972222222222222 | 34.234 |
| 0.7979166666666666 | 34.234 |
| 0.7986111111111112 | 29.823 |
| 0.7993055555555556 | 29.823 |
| 0.7999999999999999 | 29.823 |
| 0.8006944444444444 | 29.823 |
| 0.8013888888888889 | 29.823 |
| 0.8020833333333334 | 25.419 |
| 0.8027777777777777 | 25.419 |
| 0.8034722222222223 | 21.024 |
| 0.8041666666666667 | 21.024 |
| 0.8048611111111111 | 21.024 |
| 0.8055555555555555 | 21.024 |
| 0.80625 | 21.024 |
| 0.8069444444444445 | 16.636 |
| 0.8076388888888889 | 16.636 |
| 0.8083333333333332 | 16.636 |
| 0.8090277777777778 | 16.636 |
| 0.8097222222222222 | 12.257 |
| 0.8104166666666667 | 12.257 |
| 0.811111111111111 | 12.257 |
| 0.8118055555555556 | 12.257 |
| 0.8125 | 12.257 |
| 0.8131944444444444 | 7.887 |
| 0.813888888888889 | 7.887 |
| 0.8145833333333333 | 7.887 |
| 0.8152777777777778 | 7.887 |
| 0.8159722222222222 | 7.887 |
| 0.8166666666666668 | 3.525 |
| 0.8173611111111111 | 3.525 |
| 0.8180555555555555 | 3.525 |
| 0.81875 | 3.525 |
| 0.8194444444444445 | 3.525 |
| 0.8201388888888889 | 3.525 |
| 0.8208333333333333 | 3.525 |
| 0.8215277777777777 | 3.525 |
| 0.8222222222222223 | 0 |
| 0.8229166666666666 | 0 |
| 0.8236111111111111 | 0 |
| 0.8243055555555556 | 0 |
| 0.8250000000000001 | 0 |
| 0.8256944444444444 | 0 |
| 0.8263888888888888 | 0 |
| 0.8270833333333334 | 0 |
| 0.8277777777777778 | 0 |
| 0.8284722222222222 | 0 |
| 0.8291666666666666 | 0 |
| 0.8298611111111112 | 0 |
| 0.8305555555555556 | 0 |
| 0.8312499999999999 | 0 |
| 0.8319444444444444 | 0 |
| 0.8326388888888889 | 0 |
| 0.8333333333333334 | 0 |
| 0.8340277777777777 | 0 |
| 0.8347222222222223 | 0 |
| 0.8354166666666667 | 0 |
| 0.8361111111111111 | 0 |
| 0.8368055555555555 | 0 |
| 0.8375 | 0 |
| 0.8381944444444445 | 0 |
| 0.8388888888888889 | 0 |
| 0.8395833333333332 | 0 |
| 0.8402777777777778 | 0 |
| 0.8409722222222222 | 0 |
| 0.8416666666666667 | 0 |
| 0.842361111111111 | 0 |
| 0.8430555555555556 | 0 |
| 0.84375 | 0 |
| 0.8444444444444444 | 0 |
| 0.845138888888889 | 0 |
| 0.8458333333333333 | 0 |
| 0.8465277777777778 | 0 |
| 0.8472222222222222 | 0 |
| 0.8479166666666668 | 0 |
| 0.8486111111111111 | 0 |
| 0.8493055555555555 | 0 |
| 0.85 | 0 |
| 0.8506944444444445 | 0 |
| 0.8513888888888889 | 0 |
| 0.8520833333333333 | 0 |
| 0.8527777777777777 | 0 |
| 0.8534722222222223 | 0 |
| 0.8541666666666666 | 0 |
| 0.8548611111111111 | 0 |
| 0.8555555555555556 | 0 |
| 0.8562500000000001 | 0 |
| 0.8569444444444444 | 0 |
| 0.8576388888888888 | 0 |
| 0.8583333333333334 | 0 |
| 0.8590277777777778 | 0 |
| 0.8597222222222222 | 0 |
| 0.8604166666666666 | 0 |
| 0.8611111111111112 | 0 |
| 0.8618055555555556 | 0 |
| 0.8624999999999999 | 0 |
| 0.8631944444444444 | 0 |
| 0.8638888888888889 | 0 |
| 0.8645833333333334 | 0 |
| 0.8652777777777777 | 0 |
| 0.8659722222222223 | 0 |
| 0.8666666666666667 | 0 |
| 0.8673611111111111 | 0 |
| 0.8680555555555555 | 0 |
| 0.86875 | 0 |
| 0.8694444444444445 | 0 |
| 0.8701388888888889 | 0 |
| 0.8708333333333332 | 0 |
| 0.8715277777777778 | 0 |
| 0.8722222222222222 | 0 |
| 0.8729166666666667 | 0 |
| 0.873611111111111 | 0 |
| 0.8743055555555556 | 0 |
| 0.875 | 0 |
| 0.8756944444444444 | 0 |
| 0.876388888888889 | 0 |
| 0.8770833333333333 | 0 |
| 0.8777777777777778 | 0 |
| 0.8784722222222222 | 0 |
| 0.8791666666666668 | 0 |
| 0.8798611111111111 | 0 |
| 0.8805555555555555 | 0 |
| 0.88125 | 0 |
| 0.8819444444444445 | 0 |
| 0.8826388888888889 | 0 |
| 0.8833333333333333 | 0 |
| 0.8840277777777777 | 0 |
| 0.8847222222222223 | 0 |
| 0.8854166666666666 | 0 |
| 0.8861111111111111 | 0 |
| 0.8868055555555556 | 0 |
| 0.8875000000000001 | 0 |
| 0.8881944444444444 | 0 |
| 0.8888888888888888 | 0 |
| 0.8895833333333334 | 0 |
| 0.8902777777777778 | 0 |
| 0.8909722222222222 | 0 |
| 0.8916666666666666 | 0 |
| 0.8923611111111112 | 0 |
| 0.8930555555555556 | 0 |
| 0.8937499999999999 | 0 |
| 0.8944444444444444 | 0 |
| 0.8951388888888889 | 0 |
| 0.8958333333333334 | 0 |
| 0.8965277777777777 | 0 |
| 0.8972222222222223 | 0 |
| 0.8979166666666667 | 0 |
| 0.8986111111111111 | 0 |
| 0.8993055555555555 | 0 |
| 0.9 | 0 |
| 0.9006944444444445 | 0 |
| 0.9013888888888889 | 0 |
| 0.9020833333333332 | 0 |
| 0.9027777777777778 | 0 |
| 0.9034722222222222 | 0 |
| 0.9041666666666667 | 0 |
| 0.904861111111111 | 0 |
| 0.9055555555555556 | 0 |
| 0.90625 | 0 |
| 0.9069444444444444 | 0 |
| 0.907638888888889 | 0 |
| 0.9083333333333333 | 0 |
| 0.9090277777777778 | 0 |
| 0.9097222222222222 | 0 |
| 0.9104166666666668 | 0 |
| 0.9111111111111111 | 0 |
| 0.9118055555555555 | 0 |
| 0.9125 | 0 |
| 0.9131944444444445 | 0 |
| 0.9138888888888889 | 0 |
| 0.9145833333333333 | 0 |
| 0.9152777777777777 | 0 |
| 0.9159722222222223 | 0 |
| 0.9166666666666666 | 0 |
| 0.9173611111111111 | 0 |
| 0.9180555555555556 | 0 |
| 0.9187500000000001 | 0 |
| 0.9194444444444444 | 0 |
| 0.9201388888888888 | 0 |
| 0.9208333333333334 | 0 |
| 0.9215277777777778 | 0 |
| 0.9222222222222222 | 0 |
| 0.9229166666666666 | 0 |
| 0.9236111111111112 | 0 |
| 0.9243055555555556 | 0 |
| 0.9249999999999999 | 0 |
| 0.9256944444444444 | 0 |
| 0.9263888888888889 | 0 |
| 0.9270833333333334 | 0 |
| 0.9277777777777777 | 0 |
| 0.9284722222222223 | 0 |
| 0.9291666666666667 | 0 |
| 0.9298611111111111 | 0 |
| 0.9305555555555555 | 0 |
| 0.93125 | 0 |
| 0.9319444444444445 | 0 |
| 0.9326388888888889 | 0 |
| 0.9333333333333332 | 0 |
| 0.9340277777777778 | 0 |
| 0.9347222222222222 | 0 |
| 0.9354166666666667 | 0 |
| 0.936111111111111 | 0 |
| 0.9368055555555556 | 0 |
| 0.9375 | 0 |
| 0.9381944444444444 | 0 |
| 0.938888888888889 | 0 |
| 0.9395833333333333 | 0 |
| 0.9402777777777778 | 0 |
| 0.9409722222222222 | 0 |
| 0.9416666666666668 | 0 |
| 0.9423611111111111 | 0 |
| 0.9430555555555555 | 0 |
| 0.94375 | 0 |
| 0.9444444444444445 | 0 |
| 0.9451388888888889 | 0 |
| 0.9458333333333333 | 0 |
| 0.9465277777777777 | 0 |
| 0.9472222222222223 | 0 |
| 0.9479166666666666 | 0 |
| 0.9486111111111111 | 0 |
| 0.9493055555555556 | 0 |
| 0.9500000000000001 | 0 |
| 0.9506944444444444 | 0 |
| 0.9513888888888888 | 0 |
| 0.9520833333333334 | 0 |
| 0.9527777777777778 | 0 |
| 0.9534722222222222 | 0 |
| 0.9541666666666666 | 0 |
| 0.9548611111111112 | 0 |
| 0.9555555555555556 | 0 |
| 0.9562499999999999 | 0 |
| 0.9569444444444444 | 0 |
| 0.9576388888888889 | 0 |
| 0.9583333333333334 | 0 |
| 0.9590277777777777 | 0 |
| 0.9597222222222223 | 0 |
| 0.9604166666666667 | 0 |
| 0.9611111111111111 | 0 |
| 0.9618055555555555 | 0 |
| 0.9625 | 0 |
| 0.9631944444444445 | 0 |
| 0.9638888888888889 | 0 |
| 0.9645833333333332 | 0 |
| 0.9652777777777778 | 0 |
| 0.9659722222222222 | 0 |
| 0.9666666666666667 | 0 |
| 0.967361111111111 | 0 |
| 0.9680555555555556 | 0 |
| 0.96875 | 0 |
| 0.9694444444444444 | 0 |
| 0.970138888888889 | 0 |
| 0.9708333333333333 | 0 |
| 0.9715277777777778 | 0 |
| 0.9722222222222222 | 0 |
| 0.9729166666666668 | 0 |
| 0.9736111111111111 | 0 |
| 0.9743055555555555 | 0 |
| 0.975 | 0 |
| 0.9756944444444445 | 0 |
| 0.9763888888888889 | 0 |
| 0.9770833333333333 | 0 |
| 0.9777777777777777 | 0 |
| 0.9784722222222223 | 0 |
| 0.9791666666666666 | 0 |
| 0.9798611111111111 | 0 |
| 0.9805555555555556 | 0 |
| 0.9812500000000001 | 0 |
| 0.9819444444444444 | 0 |
| 0.9826388888888888 | 0 |
| 0.9833333333333334 | 0 |
| 0.9840277777777778 | 0 |
| 0.9847222222222222 | 0 |
| 0.9854166666666666 | 0 |
| 0.9861111111111112 | 0 |
| 0.9868055555555556 | 0 |
| 0.9874999999999999 | 0 |
| 0.9881944444444444 | 0 |
| 0.9888888888888889 | 0 |
| 0.9895833333333334 | 0 |
| 0.9902777777777777 | 0 |
| 0.9909722222222223 | 0 |
| 0.9916666666666667 | 0 |
| 0.9923611111111111 | 0 |
| 0.9930555555555555 | 0 |
| 0.99375 | 0 |
| 0.9944444444444445 | 0 |
| 0.9951388888888889 | 0 |
| 0.9958333333333332 | 0 |
| 0.9965277777777778 | 0 |
| 0.9972222222222222 | 0 |
| 0.9979166666666667 | 0 |
| 0.998611111111111 | 0 |
| 0.9993055555555556 | 0 |